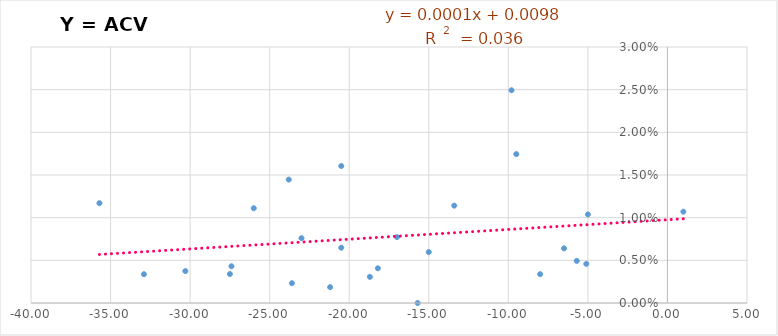
| Category | Y = ACV /año |
|---|---|
| -30.30000000000001 | 0.004 |
| -15.0 | 0.006 |
| -23.0 | 0.008 |
| -8.0 | 0.003 |
| -35.69999999999999 | 0.012 |
| -18.69999999999999 | 0.003 |
| -32.900000000000006 | 0.003 |
| -20.5 | 0.016 |
| -23.599999999999994 | 0.002 |
| -23.80000000000001 | 0.014 |
| -20.5 | 0.006 |
| -18.19999999999999 | 0.004 |
| -15.699999999999989 | 0 |
| -27.400000000000006 | 0.004 |
| -5.0 | 0.01 |
| -17.0 | 0.008 |
| 1.0 | 0.011 |
| -26.0 | 0.011 |
| -5.699999999999989 | 0.005 |
| -27.5 | 0.003 |
| -9.5 | 0.017 |
| -21.19999999999999 | 0.002 |
| -9.800000000000011 | 0.025 |
| -6.5 | 0.006 |
| -5.099999999999994 | 0.005 |
| -13.400000000000006 | 0.011 |